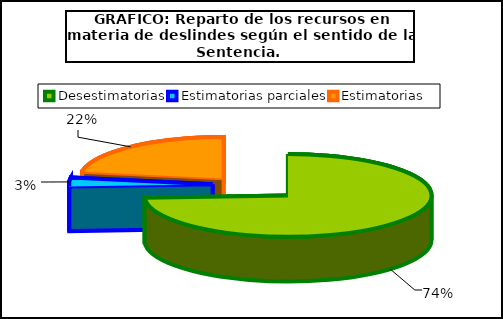
| Category | Número de recursos |
|---|---|
| Desestimatorias | 43 |
| Estimatorias parciales | 2 |
| Estimatorias  | 13 |